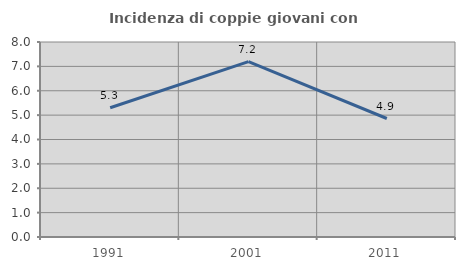
| Category | Incidenza di coppie giovani con figli |
|---|---|
| 1991.0 | 5.303 |
| 2001.0 | 7.194 |
| 2011.0 | 4.861 |